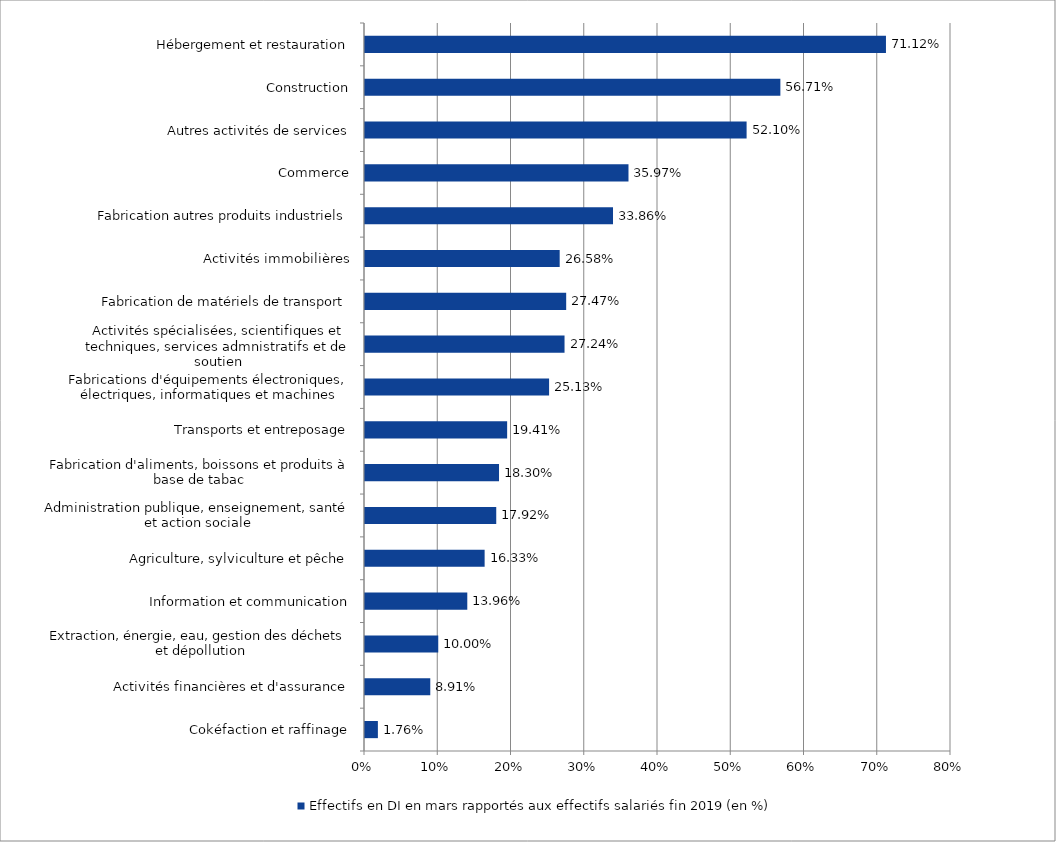
| Category | Effectifs en DI en mars rapportés aux effectifs salariés fin 2019 (en %) |
|---|---|
| Cokéfaction et raffinage | 0.018 |
| Activités financières et d'assurance | 0.089 |
| Extraction, énergie, eau, gestion des déchets et dépollution | 0.1 |
| Information et communication | 0.14 |
| Agriculture, sylviculture et pêche | 0.163 |
| Administration publique, enseignement, santé et action sociale | 0.179 |
| Fabrication d'aliments, boissons et produits à base de tabac | 0.183 |
| Transports et entreposage | 0.194 |
| Fabrications d'équipements électroniques, électriques, informatiques et machines | 0.251 |
| Activités spécialisées, scientifiques et techniques, services admnistratifs et de soutien | 0.272 |
| Fabrication de matériels de transport | 0.275 |
| Activités immobilières | 0.266 |
| Fabrication autres produits industriels | 0.339 |
| Commerce | 0.36 |
| Autres activités de services | 0.521 |
| Construction | 0.567 |
| Hébergement et restauration | 0.711 |